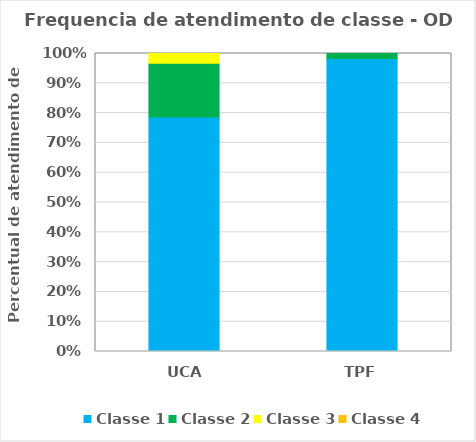
| Category | Classe 1 | Classe 2 | Classe 3 | Classe 4 |
|---|---|---|---|---|
| UCA | 0.787 | 0.18 | 0.033 | 0 |
| TPF | 0.984 | 0.016 | 0 | 0 |